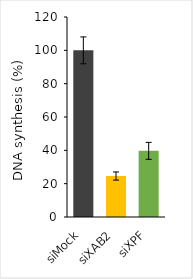
| Category | Series 0 |
|---|---|
| siMock | 100 |
| siXAB2 | 24.58 |
| siXPF | 39.691 |